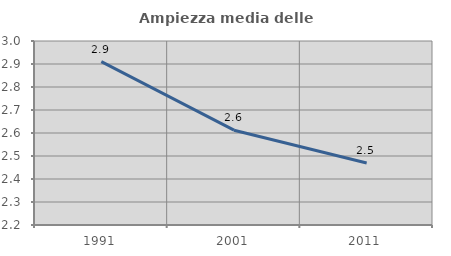
| Category | Ampiezza media delle famiglie |
|---|---|
| 1991.0 | 2.911 |
| 2001.0 | 2.612 |
| 2011.0 | 2.47 |